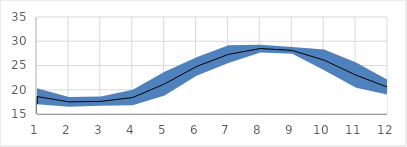
| Category | Max | Average | Min |
|---|---|---|---|
| 1.0 | 20.3 | 18.6 | 17 |
| 2.0 | 18.5 | 17.5 | 16.5 |
| 3.0 | 18.6 | 17.6 | 16.7 |
| 4.0 | 20 | 18.4 | 16.8 |
| 5.0 | 23.7 | 21.2 | 18.8 |
| 6.0 | 26.7 | 24.8 | 22.9 |
| 7.0 | 29.2 | 27.3 | 25.5 |
| 8.0 | 29.3 | 28.5 | 27.7 |
| 9.0 | 28.8 | 28.1 | 27.4 |
| 10.0 | 28.3 | 26.1 | 24 |
| 11.0 | 25.6 | 23 | 20.4 |
| 12.0 | 22 | 20.5 | 19 |